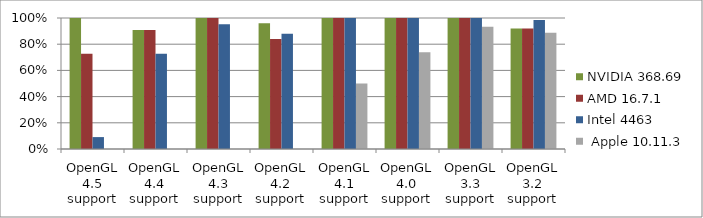
| Category | NVIDIA 368.69 | AMD 16.7.1 | Intel 4463 |  Apple 10.11.3 |
|---|---|---|---|---|
| OpenGL 4.5 support | 1 | 0.727 | 0.091 | 0 |
| OpenGL 4.4 support | 0.909 | 0.909 | 0.727 | 0 |
| OpenGL 4.3 support | 1 | 1 | 0.952 | 0 |
| OpenGL 4.2 support | 0.96 | 0.84 | 0.88 | 0 |
| OpenGL 4.1 support | 1 | 1 | 1 | 0.5 |
| OpenGL 4.0 support | 1 | 1 | 1 | 0.739 |
| OpenGL 3.3 support | 1 | 1 | 1 | 0.933 |
| OpenGL 3.2 support | 0.919 | 0.919 | 0.984 | 0.887 |